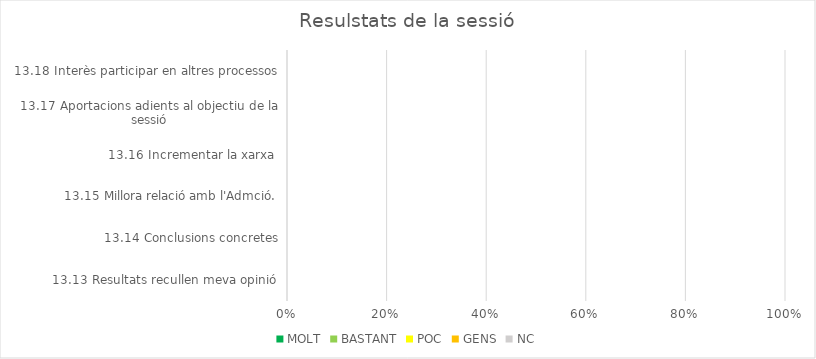
| Category | MOLT | BASTANT | POC | GENS | NC |
|---|---|---|---|---|---|
| 13.13 Resultats recullen meva opinió | 0 | 0 | 0 | 0 | 0 |
| 13.14 Conclusions concretes | 0 | 0 | 0 | 0 | 0 |
| 13.15 Millora relació amb l'Admció. | 0 | 0 | 0 | 0 | 0 |
| 13.16 Incrementar la xarxa  | 0 | 0 | 0 | 0 | 0 |
| 13.17 Aportacions adients al objectiu de la sessió | 0 | 0 | 0 | 0 | 0 |
| 13.18 Interès participar en altres processos | 0 | 0 | 0 | 0 | 0 |